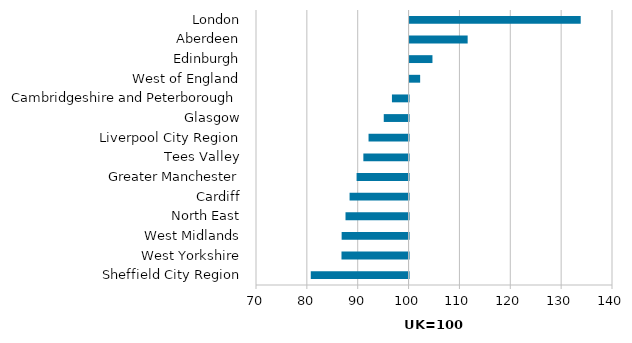
| Category | GVA per hour |
|---|---|
| Sheffield City Region | 80.77 |
| West Yorkshire | 86.81 |
| West Midlands | 86.84 |
| North East | 87.6 |
| Cardiff | 88.4 |
| Greater Manchester | 89.78 |
| Tees Valley | 91.11 |
| Liverpool City Region | 92.13 |
| Glasgow | 95.12 |
| Cambridgeshire and Peterborough | 96.73 |
| West of England | 102.08 |
| Edinburgh | 104.5 |
| Aberdeen | 111.42 |
| London | 133.65 |